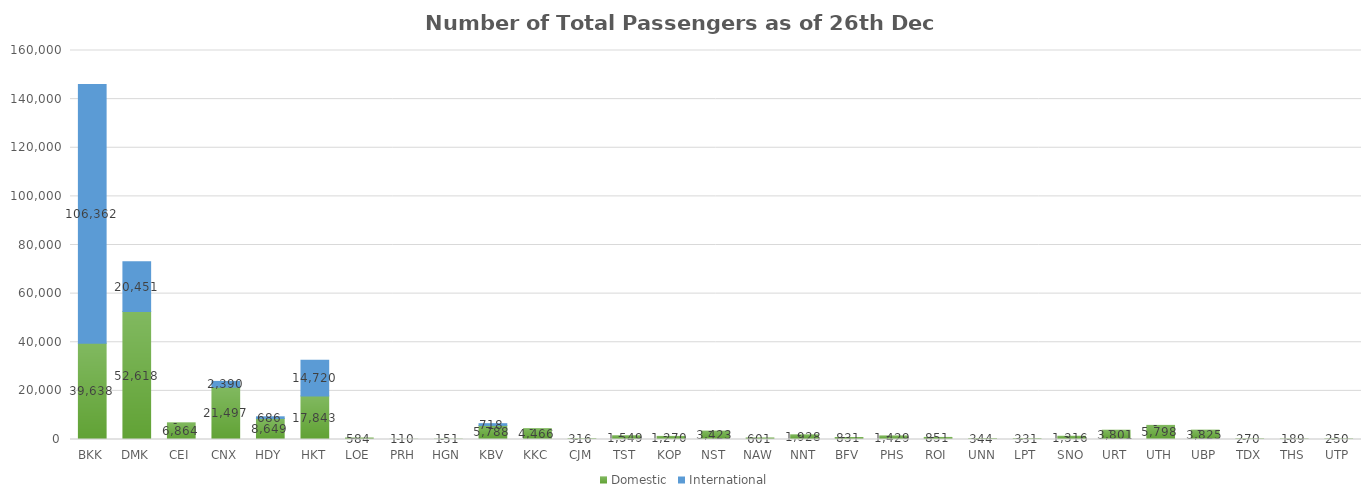
| Category | Domestic | International |
|---|---|---|
| BKK | 39638 | 106362 |
| DMK | 52618 | 20451 |
| CEI | 6864 | 0 |
| CNX | 21497 | 2390 |
| HDY | 8649 | 686 |
| HKT | 17843 | 14720 |
| LOE | 584 | 0 |
| PRH | 110 | 0 |
| HGN | 151 | 0 |
| KBV | 5788 | 718 |
| KKC | 4466 | 0 |
| CJM | 316 | 0 |
| TST | 1549 | 0 |
| KOP | 1270 | 0 |
| NST | 3423 | 0 |
| NAW | 601 | 0 |
| NNT | 1928 | 0 |
| BFV | 831 | 0 |
| PHS | 1429 | 0 |
| ROI | 851 | 0 |
| UNN | 344 | 0 |
| LPT | 331 | 0 |
| SNO | 1316 | 0 |
| URT | 3801 | 0 |
| UTH | 5798 | 0 |
| UBP | 3825 | 0 |
| TDX | 270 | 0 |
| THS | 189 | 0 |
| UTP | 250 | 0 |